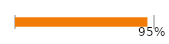
| Category | Series 0 |
|---|---|
| 0 | 0.946 |